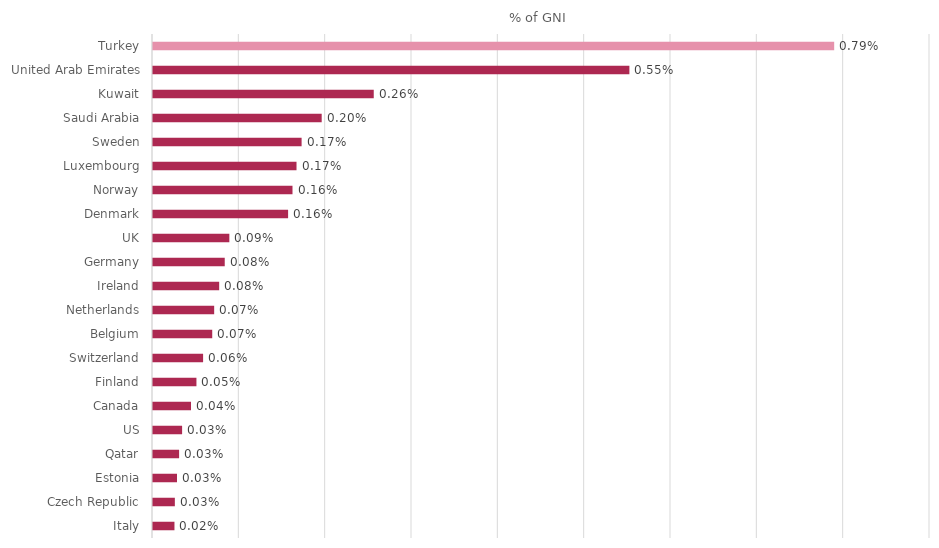
| Category | Series 0 |
|---|---|
| Turkey | 0.008 |
| United Arab Emirates | 0.006 |
| Kuwait | 0.003 |
| Saudi Arabia | 0.002 |
| Sweden | 0.002 |
| Luxembourg | 0.002 |
| Norway | 0.002 |
| Denmark | 0.002 |
| UK | 0.001 |
| Germany | 0.001 |
| Ireland | 0.001 |
| Netherlands | 0.001 |
| Belgium | 0.001 |
| Switzerland | 0.001 |
| Finland | 0.001 |
| Canada | 0 |
| US | 0 |
| Qatar | 0 |
| Estonia | 0 |
| Czech Republic | 0 |
| Italy | 0 |